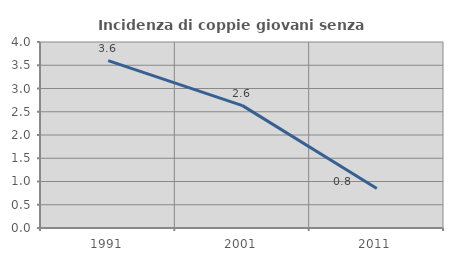
| Category | Incidenza di coppie giovani senza figli |
|---|---|
| 1991.0 | 3.6 |
| 2001.0 | 2.632 |
| 2011.0 | 0.847 |